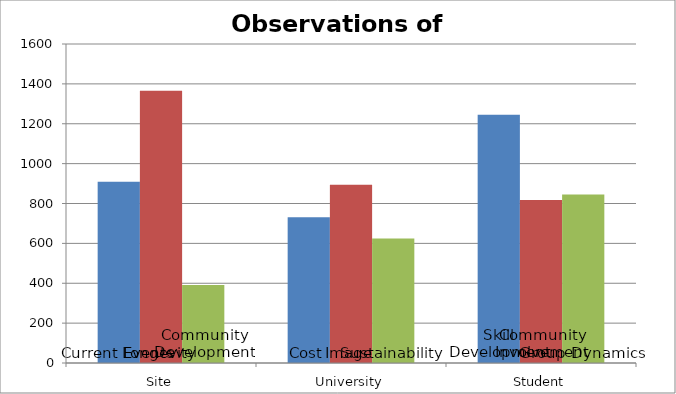
| Category | Alignment1 | Alignment2 | Alignment3 |
|---|---|---|---|
| 0 | 908.75 | 1365 | 391.5 |
| 1 | 731 | 894 | 625 |
| 2 | 1245 | 817.5 | 845 |